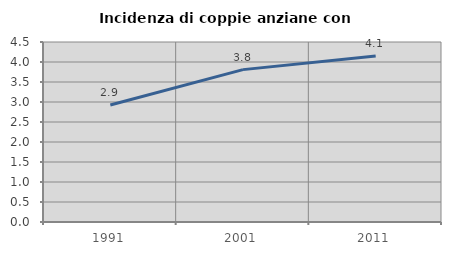
| Category | Incidenza di coppie anziane con figli |
|---|---|
| 1991.0 | 2.924 |
| 2001.0 | 3.81 |
| 2011.0 | 4.149 |